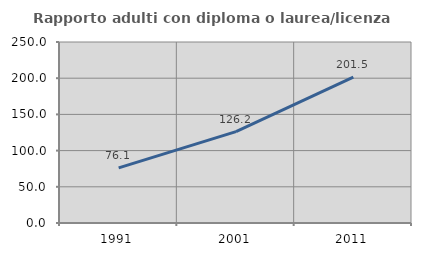
| Category | Rapporto adulti con diploma o laurea/licenza media  |
|---|---|
| 1991.0 | 76.147 |
| 2001.0 | 126.154 |
| 2011.0 | 201.515 |